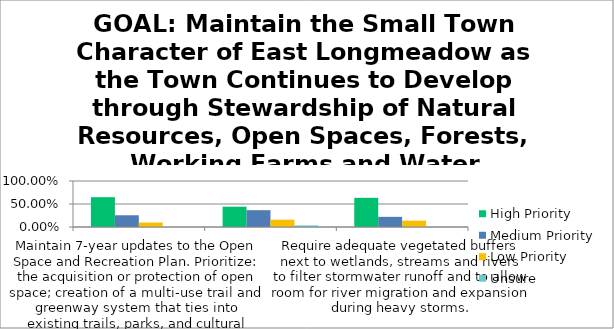
| Category | High Priority | Medium Priority | Low Priority | Unsure |
|---|---|---|---|---|
| Maintain 7-year updates to the Open Space and Recreation Plan. Prioritize: the acquisition or protection of open space; creation of a multi-use trail and greenway system that ties into existing trails, parks, and cultural destinations; and the stewardship  | 0.648 | 0.255 | 0.097 | 0 |
| Review subdivision regulations and evaluate addition of performance standards for sensitive natural areas. | 0.441 | 0.366 | 0.159 | 0.034 |
| Require adequate vegetated buffers next to wetlands, streams and rivers to filter stormwater runoff and to allow room for river migration and expansion during heavy storms. | 0.635 | 0.221 | 0.138 | 0.007 |